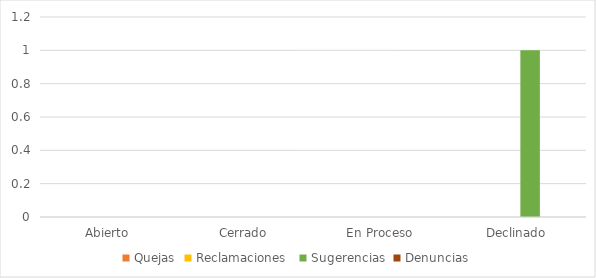
| Category | Quejas | Reclamaciones  | Sugerencias | Denuncias |
|---|---|---|---|---|
| Abierto | 0 | 0 | 0 | 0 |
| Cerrado | 0 | 0 | 0 | 0 |
| En Proceso | 0 | 0 | 0 | 0 |
| Declinado | 0 | 0 | 1 | 0 |